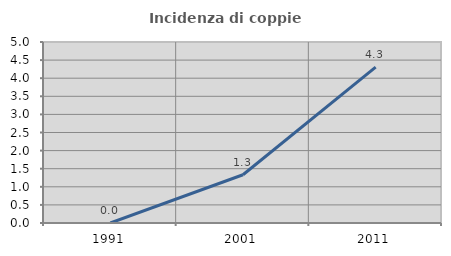
| Category | Incidenza di coppie miste |
|---|---|
| 1991.0 | 0 |
| 2001.0 | 1.333 |
| 2011.0 | 4.305 |